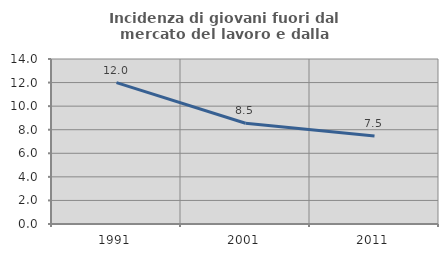
| Category | Incidenza di giovani fuori dal mercato del lavoro e dalla formazione  |
|---|---|
| 1991.0 | 12 |
| 2001.0 | 8.547 |
| 2011.0 | 7.463 |